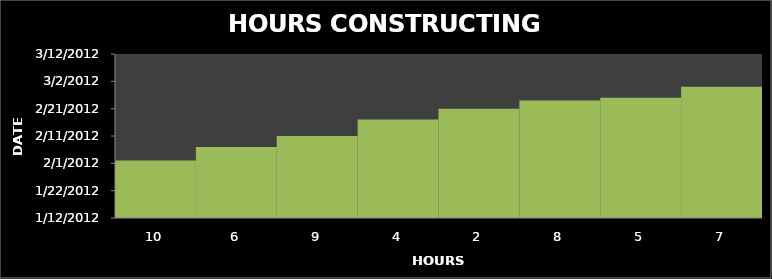
| Category | Series 0 |
|---|---|
| 10.0 | 2/2/12 |
| 6.0 | 2/7/12 |
| 9.0 | 2/11/12 |
| 4.0 | 2/17/12 |
| 2.0 | 2/21/12 |
| 8.0 | 2/24/12 |
| 5.0 | 2/25/12 |
| 7.0 | 2/29/12 |